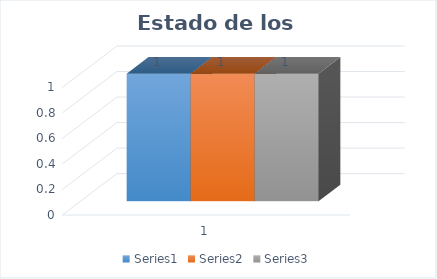
| Category | Series 0 | Series 1 | Series 2 |
|---|---|---|---|
| 0 | 1 | 1 | 1 |